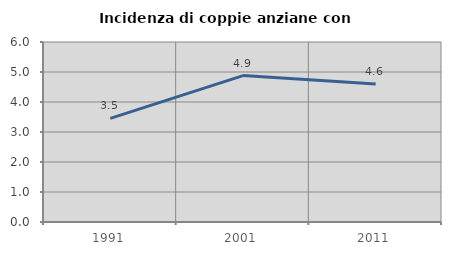
| Category | Incidenza di coppie anziane con figli |
|---|---|
| 1991.0 | 3.454 |
| 2001.0 | 4.881 |
| 2011.0 | 4.597 |